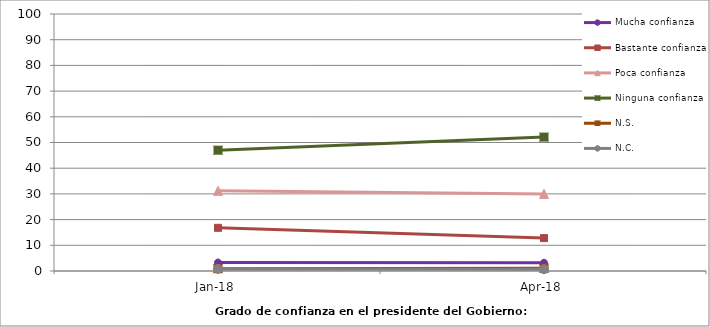
| Category | Mucha confianza | Bastante confianza | Poca confianza | Ninguna confianza | N.S. | N.C. |
|---|---|---|---|---|---|---|
| 2018-01-01 | 3.3 | 16.8 | 31.2 | 47 | 0.9 | 0.8 |
| 2018-04-01 | 3.2 | 12.8 | 30 | 52.1 | 1.1 | 0.7 |